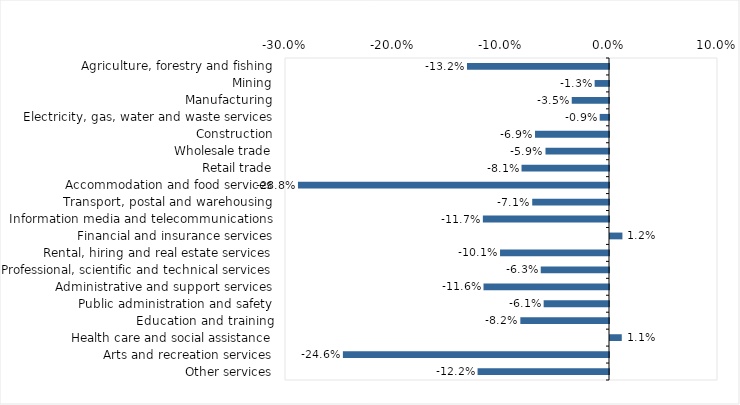
| Category | This week |
|---|---|
| Agriculture, forestry and fishing | -0.132 |
| Mining | -0.013 |
| Manufacturing | -0.034 |
| Electricity, gas, water and waste services | -0.009 |
| Construction | -0.068 |
| Wholesale trade | -0.059 |
| Retail trade | -0.081 |
| Accommodation and food services | -0.288 |
| Transport, postal and warehousing | -0.071 |
| Information media and telecommunications | -0.117 |
| Financial and insurance services | 0.012 |
| Rental, hiring and real estate services | -0.101 |
| Professional, scientific and technical services | -0.063 |
| Administrative and support services | -0.116 |
| Public administration and safety | -0.06 |
| Education and training | -0.082 |
| Health care and social assistance | 0.011 |
| Arts and recreation services | -0.246 |
| Other services | -0.122 |